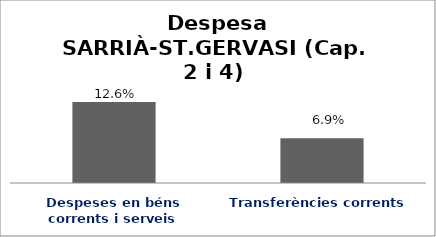
| Category | Series 0 |
|---|---|
| Despeses en béns corrents i serveis | 0.126 |
| Transferències corrents | 0.069 |